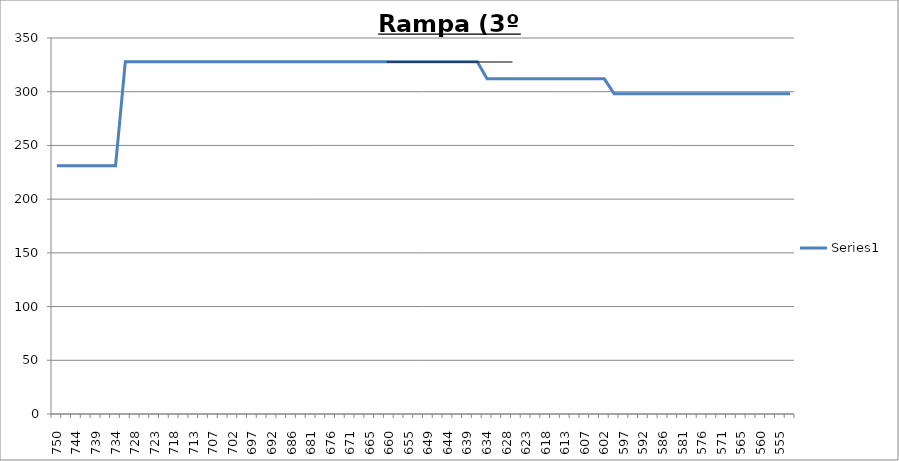
| Category | Series 0 |
|---|---|
| 750.0 | 231 |
| 747.0 | 231 |
| 744.0 | 231 |
| 742.0 | 231 |
| 739.0 | 231 |
| 736.0 | 231 |
| 734.0 | 231 |
| 731.0 | 328 |
| 728.0 | 328 |
| 726.0 | 328 |
| 723.0 | 328 |
| 721.0 | 328 |
| 718.0 | 328 |
| 715.0 | 328 |
| 713.0 | 328 |
| 710.0 | 328 |
| 707.0 | 328 |
| 705.0 | 328 |
| 702.0 | 328 |
| 699.0 | 328 |
| 697.0 | 328 |
| 694.0 | 328 |
| 692.0 | 328 |
| 689.0 | 328 |
| 686.0 | 328 |
| 684.0 | 328 |
| 681.0 | 328 |
| 678.0 | 328 |
| 676.0 | 328 |
| 673.0 | 328 |
| 671.0 | 328 |
| 668.0 | 328 |
| 665.0 | 328 |
| 663.0 | 328 |
| 660.0 | 328 |
| 657.0 | 328 |
| 655.0 | 328 |
| 652.0 | 328 |
| 649.0 | 328 |
| 647.0 | 328 |
| 644.0 | 328 |
| 642.0 | 328 |
| 639.0 | 328 |
| 636.0 | 328 |
| 634.0 | 312 |
| 631.0 | 312 |
| 628.0 | 312 |
| 626.0 | 312 |
| 623.0 | 312 |
| 621.0 | 312 |
| 618.0 | 312 |
| 615.0 | 312 |
| 613.0 | 312 |
| 610.0 | 312 |
| 607.0 | 312 |
| 605.0 | 312 |
| 602.0 | 312 |
| 599.0 | 298 |
| 597.0 | 298 |
| 594.0 | 298 |
| 592.0 | 298 |
| 589.0 | 298 |
| 586.0 | 298 |
| 584.0 | 298 |
| 581.0 | 298 |
| 578.0 | 298 |
| 576.0 | 298 |
| 573.0 | 298 |
| 571.0 | 298 |
| 568.0 | 298 |
| 565.0 | 298 |
| 563.0 | 298 |
| 560.0 | 298 |
| 557.0 | 298 |
| 555.0 | 298 |
| 552.0 | 298 |